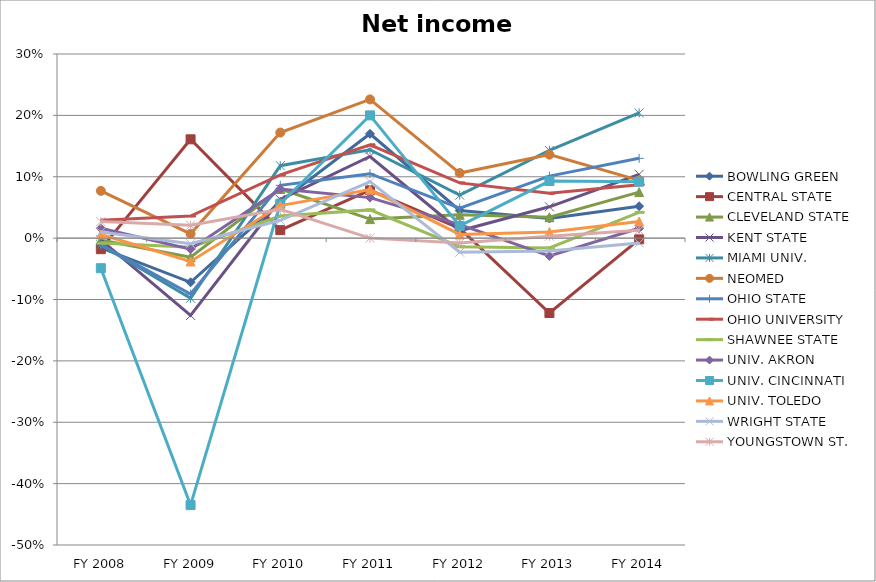
| Category | BOWLING GREEN  | CENTRAL STATE  | CLEVELAND STATE  | KENT STATE  | MIAMI UNIV.  | NEOMED  | OHIO STATE  | OHIO UNIVERSITY  | SHAWNEE STATE  | UNIV. AKRON  | UNIV. CINCINNATI  | UNIV. TOLEDO  | WRIGHT STATE  | YOUNGSTOWN ST.  |
|---|---|---|---|---|---|---|---|---|---|---|---|---|---|---|
| FY 2014 | 0.052 | -0.002 | 0.075 | 0.104 | 0.204 | 0.094 | 0.13 | 0.087 | 0.042 | 0.016 | 0.092 | 0.027 | -0.008 | 0.013 |
| FY 2013 | 0.032 | -0.122 | 0.034 | 0.051 | 0.143 | 0.136 | 0.101 | 0.073 | -0.016 | -0.029 | 0.093 | 0.01 | -0.021 | 0.003 |
| FY 2012 | 0.045 | 0.016 | 0.038 | 0.012 | 0.07 | 0.106 | 0.049 | 0.09 | -0.014 | 0.022 | 0.02 | 0.006 | -0.023 | -0.008 |
| FY 2011 | 0.17 | 0.078 | 0.031 | 0.133 | 0.144 | 0.226 | 0.105 | 0.152 | 0.046 | 0.066 | 0.2 | 0.079 | 0.092 | 0 |
| FY 2010 | 0.059 | 0.013 | 0.08 | 0.063 | 0.118 | 0.172 | 0.086 | 0.103 | 0.036 | 0.08 | 0.056 | 0.053 | 0.029 | 0.047 |
| FY 2009 | -0.072 | 0.161 | -0.031 | -0.126 | -0.098 | 0.007 | -0.091 | 0.036 | -0.015 | -0.018 | -0.435 | -0.038 | -0.009 | 0.021 |
| FY 2008 | -0.016 | -0.018 | -0.003 | -0.003 | -0.011 | 0.077 | -0.011 | 0.029 | -0.008 | 0.016 | -0.049 | 0.006 | 0.01 | 0.027 |